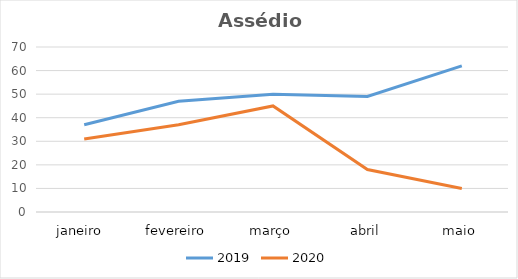
| Category | 2019 | 2020 |
|---|---|---|
| janeiro  | 37 | 31 |
| fevereiro | 47 | 37 |
| março | 50 | 45 |
| abril | 49 | 18 |
| maio | 62 | 10 |